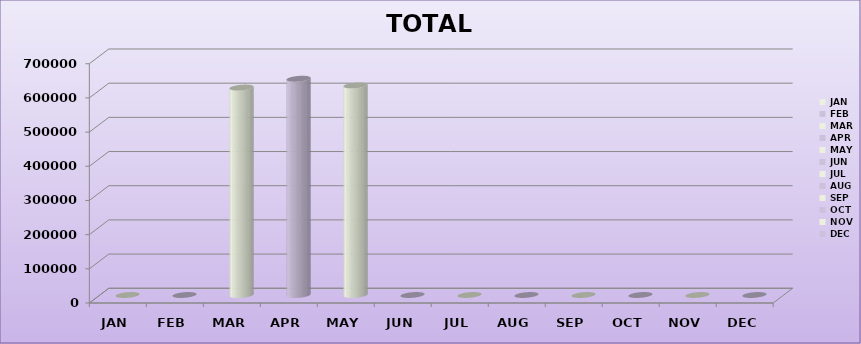
| Category | TOTAL REVENUE |
|---|---|
| 0 | 0 |
| 1 | 0 |
| 2 | 606932.52 |
| 3 | 632800.32 |
| 4 | 613263.03 |
| 5 | 0 |
| 6 | 0 |
| 7 | 0 |
| 8 | 0 |
| 9 | 0 |
| 10 | 0 |
| 11 | 0 |